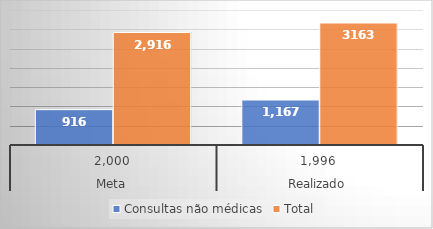
| Category | Consultas não médicas | Total |
|---|---|---|
| 0 | 916 | 2916 |
| 1 | 1167 | 3163 |